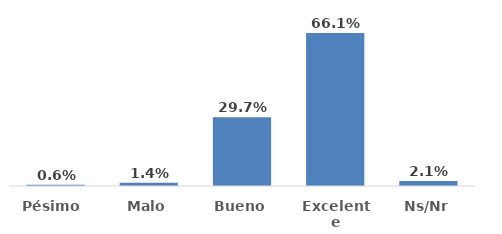
| Category | Series 0 |
|---|---|
| Pésimo  | 0.006 |
| Malo | 0.014 |
| Bueno | 0.297 |
| Excelente | 0.661 |
| Ns/Nr | 0.021 |